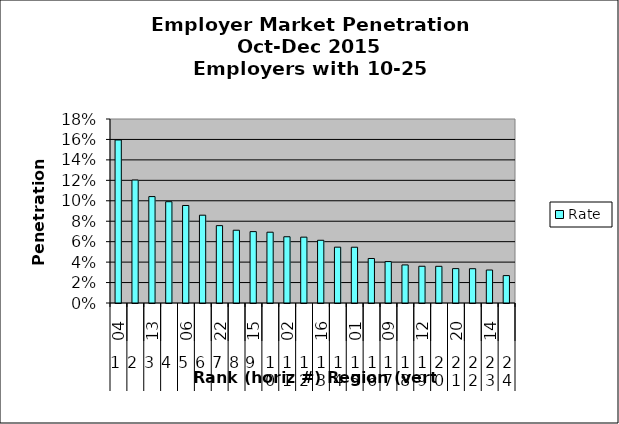
| Category | Rate |
|---|---|
| 0 | 0.159 |
| 1 | 0.12 |
| 2 | 0.104 |
| 3 | 0.099 |
| 4 | 0.095 |
| 5 | 0.086 |
| 6 | 0.076 |
| 7 | 0.071 |
| 8 | 0.07 |
| 9 | 0.069 |
| 10 | 0.065 |
| 11 | 0.064 |
| 12 | 0.061 |
| 13 | 0.055 |
| 14 | 0.055 |
| 15 | 0.044 |
| 16 | 0.041 |
| 17 | 0.037 |
| 18 | 0.036 |
| 19 | 0.036 |
| 20 | 0.034 |
| 21 | 0.034 |
| 22 | 0.032 |
| 23 | 0.027 |